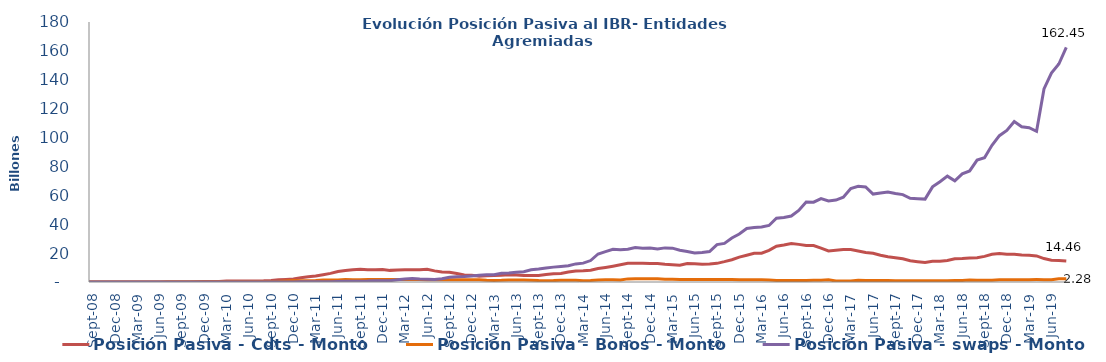
| Category | Posición Pasiva - Cdts - Monto | Posición Pasiva - Bonos - Monto | Posición Pasiva - swaps - Monto |
|---|---|---|---|
| 2008-07-01 | 0 | 0 | 0 |
| 2008-08-01 | 0 | 0 | 0 |
| 2008-09-01 | 1000000 | 0 | 0 |
| 2008-10-01 | 1000000 | 0 | 0 |
| 2008-11-01 | 0 | 0 | 0 |
| 2008-12-01 | 0 | 0 | 0 |
| 2009-01-01 | 0 | 0 | 0 |
| 2009-02-01 | 0 | 0 | 0 |
| 2009-03-01 | 0 | 0 | 0 |
| 2009-04-01 | 0 | 0 | 0 |
| 2009-05-01 | 0 | 0 | 0 |
| 2009-06-01 | 0 | 0 | 0 |
| 2009-07-01 | 0 | 177200000000 | 0 |
| 2009-08-01 | 0 | 177200000000 | 0 |
| 2009-09-01 | 0 | 177200000000 | 0 |
| 2009-10-01 | 1000000 | 177200000000 | 0 |
| 2009-11-01 | 133701000000 | 177200000000 | 0 |
| 2009-12-01 | 307701000000 | 177200000000 | 700000000 |
| 2010-01-01 | 320201000000 | 177200000000 | 2600000000 |
| 2010-02-01 | 357551000000 | 177200000000 | 3500000000 |
| 2010-03-01 | 655371000000 | 192000000000 | 19200000000 |
| 2010-04-01 | 675721000000 | 192000000000 | 34200000000 |
| 2010-05-01 | 681721000000 | 192000000000 | 51500000000 |
| 2010-06-01 | 705721000000 | 205600000000 | 50500000000 |
| 2010-07-01 | 737221000000 | 205600000000 | 40000000000 |
| 2010-08-01 | 785721000000 | 205600000000 | 39000000000 |
| 2010-09-01 | 1033321000000 | 205600000000 | 55000000000 |
| 2010-10-01 | 1530639000000 | 392650000000 | 52000000000 |
| 2010-11-01 | 1811289030230 | 743290000000 | 58000000000 |
| 2010-12-01 | 2062699030230 | 962710000000 | 66000000000 |
| 2011-01-01 | 2879749030230 | 807496000000 | 89000000000 |
| 2011-02-01 | 3592057311520 | 807496000000 | 121000000000 |
| 2011-03-01 | 4094394311520 | 994310000000 | 109000000000 |
| 2011-04-01 | 5034075281290 | 1342146000000 | 153000000000 |
| 2011-05-01 | 5963198881774 | 1342146000000 | 197000000000 |
| 2011-06-01 | 7250771346191 | 1342146000000 | 367000000000 |
| 2011-07-01 | 7889921570652 | 1675923000000 | 437000000000 |
| 2011-08-01 | 8556448085668 | 1578873000000 | 462000000000 |
| 2011-09-01 | 8833885282168 | 1635362000000 | 475000000000 |
| 2011-10-01 | 8457699585668 | 1767199000000 | 614000000000 |
| 2011-11-01 | 8549620287184 | 1767199000000 | 875000000000 |
| 2011-12-01 | 8705544763684 | 1767199000000 | 833000000000 |
| 2012-01-01 | 8049489811238 | 1767199000000 | 876000000000 |
| 2012-02-01 | 8270462411238 | 1767199000000 | 1563000000000 |
| 2012-03-01 | 8518277207338 | 1737198999996 | 2146000000000 |
| 2012-04-01 | 8443527467338 | 1737199000000 | 2394500000000 |
| 2012-05-01 | 8450299073338 | 1760649000000 | 2078750000000 |
| 2012-06-01 | 8778980763536 | 1608181000000 | 1904350000000 |
| 2012-07-01 | 7700629135460 | 1608181000000 | 1698707000000 |
| 2012-08-01 | 6932102972154 | 1608181000000 | 2198807000000 |
| 2012-09-01 | 6675552972154 | 1608181000000 | 3297552000000 |
| 2012-10-01 | 5825952472154 | 1516631000000 | 3592517000000 |
| 2012-11-01 | 4826904430154 | 1510256000000 | 3782805083331 |
| 2012-12-01 | 4650075554154 | 1509355000000 | 4185362081845 |
| 2013-01-01 | 4016525414921 | 1509354931416.67 | 4692538642439 |
| 2013-02-01 | 4272243181883 | 1147770000000 | 4990298764579 |
| 2013-03-01 | 4558993181883 | 1113970000000 | 5067351034108 |
| 2013-04-01 | 4748821181883 | 1159013000000 | 6003435133053 |
| 2013-05-01 | 5020504181883 | 1390113000000 | 6169552742390.75 |
| 2013-06-01 | 4908852681883 | 1300113000000 | 6705676089087.75 |
| 2013-07-01 | 4542666412950 | 1300097600000 | 7144037698575.75 |
| 2013-08-01 | 4538035699500 | 1259904100000 | 8418505206190.25 |
| 2013-09-01 | 4426905198533 | 1015652000000 | 8994300517255.25 |
| 2013-10-01 | 5259004198533 | 923402000000 | 9766983899621.8 |
| 2013-11-01 | 5660733384614 | 974762000000 | 10300441787153.8 |
| 2013-12-01 | 5893893284614 | 1235400000000 | 10801537325169.8 |
| 2014-01-01 | 6933122579068 | 1235400000000 | 11307303837792.8 |
| 2014-02-01 | 7613677579068 | 1235400000000 | 12524983899621.8 |
| 2014-03-01 | 7717362579068 | 936600000000 | 13071266927788.8 |
| 2014-04-01 | 8082318579068 | 1057300000000 | 14850725938985.8 |
| 2014-05-01 | 9299683175517 | 1439566000000 | 19403141857606.23 |
| 2014-06-01 | 10084195252517 | 1550812908000 | 21076466392867.23 |
| 2014-07-01 | 10972302777723 | 1550417621000 | 22642710423754.09 |
| 2014-08-01 | 11972062686643 | 1337912000000 | 22412814812363.438 |
| 2014-09-01 | 12905707081780.31 | 2154227000000 | 22678622315786.43 |
| 2014-10-01 | 13063246210954.844 | 2244227000000 | 23852851304721.203 |
| 2014-11-01 | 12953854419948.99 | 2244227000000 | 23294758403938.21 |
| 2014-12-01 | 12797175147981.03 | 2244227000000 | 23527533950320.21 |
| 2015-01-01 | 12735464045472.7 | 2244227000000 | 22844089310976.43 |
| 2015-02-01 | 12258740520049.02 | 1967427000000 | 23616016822770.98 |
| 2015-03-01 | 11959675084873.94 | 1922546000000 | 23429845881131.43 |
| 2015-04-01 | 11603104146348.63 | 1731531000000 | 21954905217570.633 |
| 2015-05-01 | 12787258765586.06 | 1731531000000 | 21137165704294.71 |
| 2015-06-01 | 12702350124119.61 | 1731531000000 | 20116838167751.242 |
| 2015-07-01 | 12326873613850.61 | 1731531000000 | 20375523033390.5 |
| 2015-08-01 | 12532631352445.61 | 1731531000000 | 21044174373204.39 |
| 2015-09-01 | 12914314312021.61 | 1731531000000 | 25886053422220.67 |
| 2015-10-01 | 14078324826522.61 | 1731531000000 | 26724546866995.008 |
| 2015-11-01 | 15387895261461.13 | 1790331000000 | 30433131895803.133 |
| 2015-12-01 | 17198106299339.13 | 1474516000000 | 33218498858606.953 |
| 2016-01-01 | 18471252279786.94 | 1474516000000 | 37083234558973.01 |
| 2016-02-01 | 19820074498199.3 | 1474516000000 | 37698368402074.71 |
| 2016-03-01 | 19910995635360.5 | 1559516000000 | 38121885099841.87 |
| 2016-04-01 | 21872523250119.66 | 1466816000000 | 39141783058519.24 |
| 2016-05-01 | 24813127348002.38 | 1059116000000 | 44164977934302.15 |
| 2016-06-01 | 25637146394228.258 | 1059116000000 | 44728113292988.33 |
| 2016-07-01 | 26607711640580.258 | 1059116000000 | 45705606091662.73 |
| 2016-08-01 | 26048927395012.82 | 1059116000000 | 49517526483113.3 |
| 2016-09-01 | 25202974900085.754 | 1059787036612.9 | 55398854669509.74 |
| 2016-10-01 | 25284571899756.367 | 1151562066774.19 | 55242666617988.44 |
| 2016-11-01 | 23434547096864.77 | 1150981261774.19 | 57761956184631.16 |
| 2016-12-01 | 21535959293189.84 | 1501604591451.61 | 56119119443202.05 |
| 2017-01-01 | 21950343369064.71 | 700243000000 | 56716284030347.41 |
| 2017-02-01 | 22437913541124.71 | 700243000000 | 58757499650223.12 |
| 2017-03-01 | 22508699373693.71 | 700243000000 | 64704229108276.48 |
| 2017-04-01 | 21508774970839.19 | 1133243000000 | 66211606669941.06 |
| 2017-05-01 | 20451439388511.71 | 1068411000000 | 65777253859007.76 |
| 2017-06-01 | 19911066434349.71 | 1068411000000 | 60894933619234.93 |
| 2017-07-01 | 18525251185322.71 | 976568000000 | 61635888515859.08 |
| 2017-08-01 | 17501216922547.781 | 976568000000 | 62349645714459.99 |
| 2017-09-01 | 16861503696848.07 | 891568000000 | 61287373903049.51 |
| 2017-10-01 | 16033651202236.707 | 891568000000 | 60491496582725.68 |
| 2017-11-01 | 14663855718312.71 | 891568000000 | 57968503538179.62 |
| 2017-12-01 | 14029447776466.201 | 891568000000 | 57632652407339.234 |
| 2018-01-01 | 13473477511044.71 | 891568000000 | 57392798372781.125 |
| 2018-02-01 | 14345353584382.71 | 891568000000 | 65871665857879.45 |
| 2018-03-01 | 14384191776904.707 | 891568000000 | 69411275754893.83 |
| 2018-04-01 | 14844263302225.71 | 918568000000 | 73289911574145.83 |
| 2018-05-01 | 16052886454266.71 | 1118568000000 | 70046783961295.945 |
| 2018-06-01 | 16243945147454.24 | 1118568000000 | 74916667687352.02 |
| 2018-07-01 | 16635494229855.71 | 1407568000000 | 76887213001782.36 |
| 2018-08-01 | 16851916145165.71 | 1261500000000 | 84402981257829.3 |
| 2018-09-01 | 17741041145165.71 | 1259000000000 | 86020631843693.48 |
| 2018-10-01 | 19205478628953.5 | 1258999999164.99 | 94613317771893.92 |
| 2018-11-01 | 19659598677128.79 | 1627030000000 | 101300492312826.36 |
| 2018-12-01 | 19206685075128.79 | 1627030000000 | 104883673702985.12 |
| 2019-01-01 | 19219413643454.664 | 1627030000000 | 111103390660546.89 |
| 2019-02-01 | 18674591687646.89 | 1627030000000 | 107501227199297.78 |
| 2019-03-01 | 18486540853470.266 | 1627030000000 | 106776186595081.17 |
| 2019-04-01 | 18080393914782.69 | 1654830000000 | 104284947187587.81 |
| 2019-05-01 | 16228914377300 | 1627030000000 | 133658510077641.11 |
| 2019-06-01 | 15097734323479.15 | 1627030000000 | 144665517254733.94 |
| 2019-07-01 | 14828212377300 | 2284030000000 | 150930692755760.22 |
| 2019-08-01 | 14455920742866.97 | 2284030000000 | 162448663120908.5 |